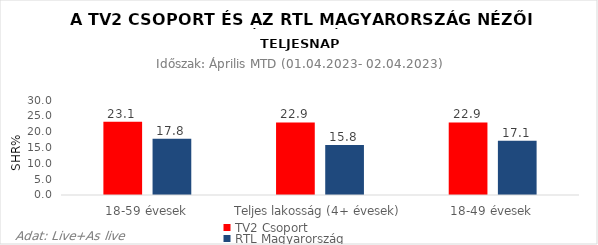
| Category | TV2 Csoport | RTL Magyarország |
|---|---|---|
| 18-59 évesek | 23.1 | 17.8 |
| Teljes lakosság (4+ évesek) | 22.9 | 15.8 |
| 18-49 évesek | 22.9 | 17.1 |